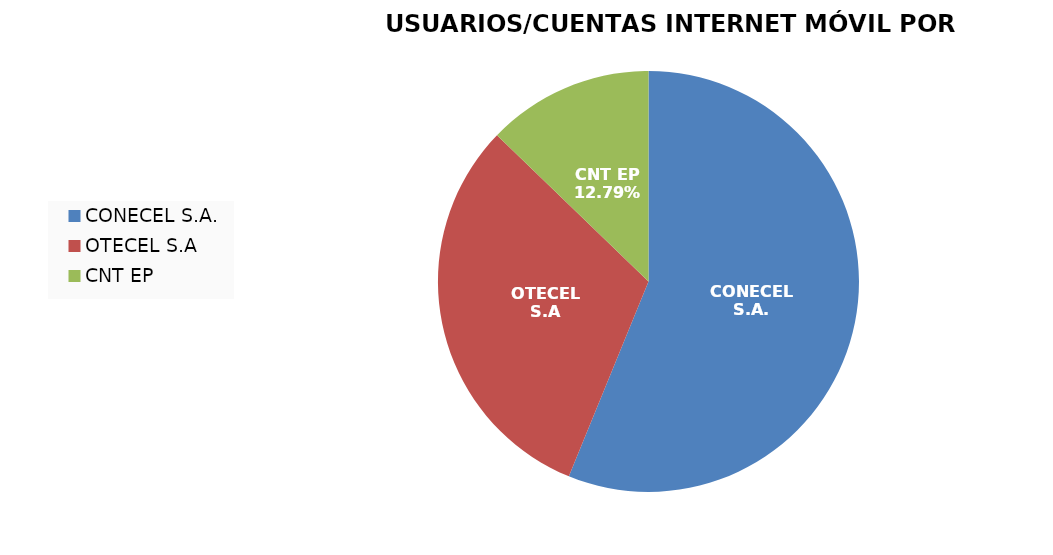
| Category | Series 0 |
|---|---|
| CONECEL S.A. | 5350308 |
| OTECEL S.A | 2956360 |
| CNT EP | 1217794 |